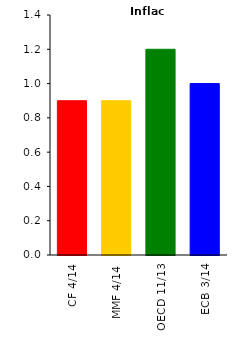
| Category | Inflace |
|---|---|
| CF 4/14 | 0.9 |
| MMF 4/14 | 0.9 |
| OECD 11/13 | 1.2 |
| ECB 3/14 | 1 |